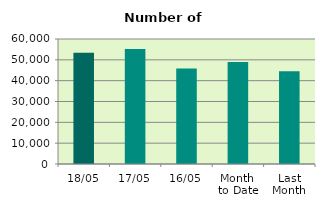
| Category | Series 0 |
|---|---|
| 18/05 | 53388 |
| 17/05 | 55232 |
| 16/05 | 45790 |
| Month 
to Date | 48919.231 |
| Last
Month | 44538 |